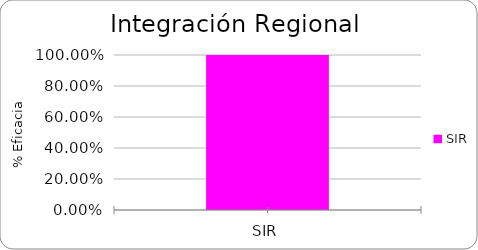
| Category | % Eficacia total |
|---|---|
| SIR | 1 |